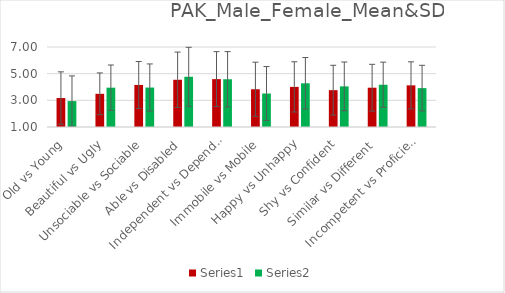
| Category | Series 0 | Series 1 |
|---|---|---|
| Old vs Young | 3.172 | 2.944 |
|  Beautiful vs Ugly | 3.489 | 3.95 |
| Unsociable vs Sociable | 4.154 | 3.959 |
| Able vs Disabled | 4.542 | 4.769 |
| Independent vs Dependent | 4.59 | 4.581 |
| Immobile vs Mobile | 3.833 | 3.512 |
| Happy vs Unhappy | 4.009 | 4.278 |
| Shy vs Confident | 3.762 | 4.047 |
| Similar vs Different | 3.947 | 4.169 |
| Incompetent vs Proficient | 4.123 | 3.916 |